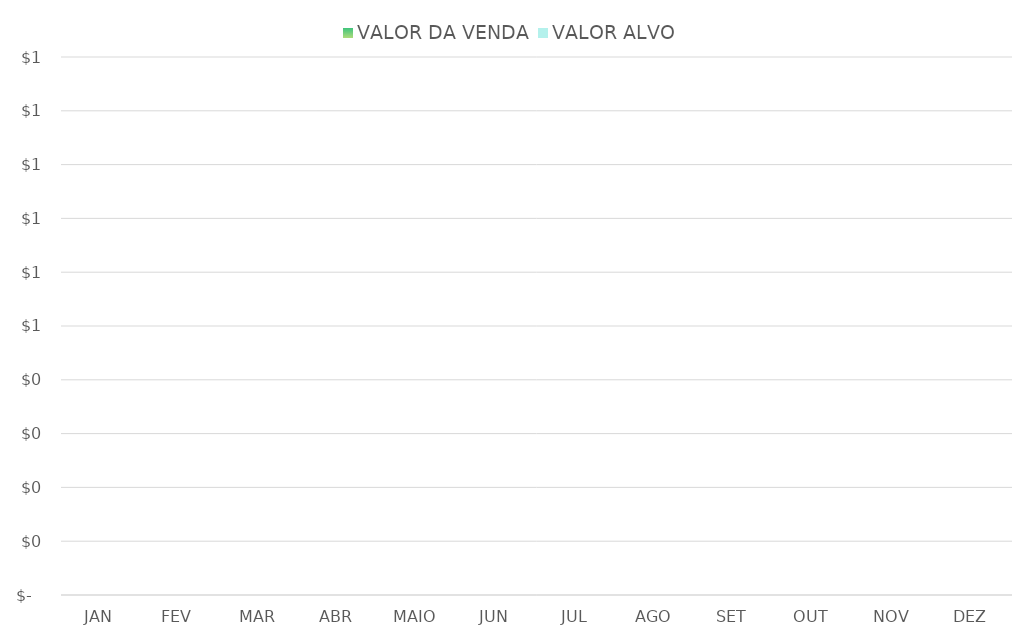
| Category | VALOR DA VENDA | VALOR ALVO |
|---|---|---|
| JAN | 0 | 0 |
| FEV | 0 | 0 |
| MAR | 0 | 0 |
| ABR | 0 | 0 |
| MAIO | 0 | 0 |
| JUN | 0 | 0 |
| JUL | 0 | 0 |
| AGO | 0 | 0 |
| SET | 0 | 0 |
| OUT | 0 | 0 |
| NOV | 0 | 0 |
| DEZ | 0 | 0 |